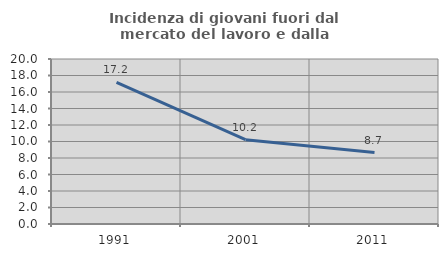
| Category | Incidenza di giovani fuori dal mercato del lavoro e dalla formazione  |
|---|---|
| 1991.0 | 17.16 |
| 2001.0 | 10.219 |
| 2011.0 | 8.667 |